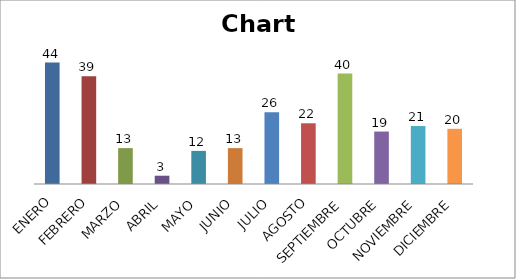
| Category | Series 0 |
|---|---|
| ENERO | 44 |
| FEBRERO | 39 |
| MARZO | 13 |
| ABRIL | 3 |
| MAYO | 12 |
| JUNIO | 13 |
| JULIO | 26 |
| AGOSTO | 22 |
| SEPTIEMBRE | 40 |
| OCTUBRE | 19 |
| NOVIEMBRE | 21 |
| DICIEMBRE | 20 |